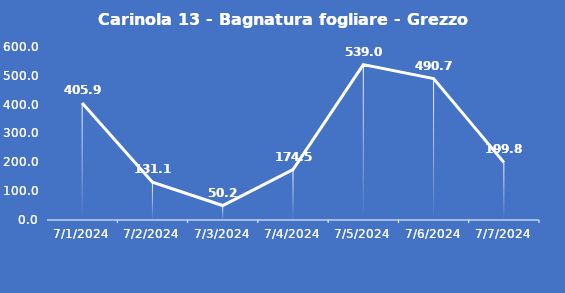
| Category | Carinola 13 - Bagnatura fogliare - Grezzo (min) |
|---|---|
| 7/1/24 | 405.9 |
| 7/2/24 | 131.1 |
| 7/3/24 | 50.2 |
| 7/4/24 | 174.5 |
| 7/5/24 | 539 |
| 7/6/24 | 490.7 |
| 7/7/24 | 199.8 |